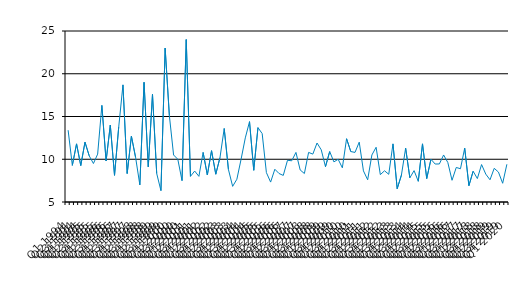
| Category | Series 0 |
|---|---|
| Q1 1994 | 13.4 |
| Q2 1994 | 9.28 |
| Q3 1994 | 11.8 |
| Q4 1994 | 9.26 |
| Q1 1995 | 12 |
| Q2 1995 | 10.4 |
| Q3 1995 | 9.5 |
| Q4 1995 | 10.6 |
| Q1 1996 | 16.3 |
| Q2 1996 | 9.8 |
| Q3 1996 | 14 |
| Q4 1996 | 8.12 |
| Q1 1997 | 13.8 |
| Q2 1997 | 18.7 |
| Q3 1997 | 8.33 |
| Q4 1997 | 12.7 |
| Q1 1998 | 10.2 |
| Q2 1998 | 7 |
| Q3 1998 | 19 |
| Q4 1998 | 9.11 |
| Q1 1999 | 17.6 |
| Q2 1999 | 8.33 |
| Q3 1999 | 6.33 |
| Q4 1999 | 23 |
| Q1 2000 | 15.1 |
| Q2 2000 | 10.5 |
| Q3 2000 | 10 |
| Q4 2000 | 7.5 |
| Q1 2001 | 24 |
| Q2 2001 | 8 |
| Q3 2001 | 8.62 |
| Q4 2001 | 8 |
| Q1 2002 | 10.8 |
| Q2 2002 | 8.16 |
| Q3 2002 | 11 |
| Q4 2002 | 8.25 |
| Q1 2003 | 10.2 |
| Q2 2003 | 13.6 |
| Q3 2003 | 8.8 |
| Q4 2003 | 6.83 |
| Q1 2004 | 7.66 |
| Q2 2004 | 10 |
| Q3 2004 | 12.5 |
| Q4 2004 | 14.4 |
| Q1 2005 | 8.71 |
| Q2 2005 | 13.7 |
| Q3 2005 | 13 |
| Q4 2005 | 8.44 |
| Q1 2006 | 7.33 |
| Q2 2006 | 8.83 |
| Q3 2006 | 8.33 |
| Q4 2006 | 8.11 |
| Q1 2007 | 9.88 |
| Q2 2007 | 9.82 |
| Q3 2007 | 10.8 |
| Q4 2007 | 8.75 |
| Q1 2008 | 8.33 |
| Q2 2008 | 10.8 |
| Q3 2008 | 10.6 |
| Q4 2008 | 11.9 |
| Q1 2009 | 11.1 |
| Q2 2009 | 9.13 |
| Q3 2009 | 10.9 |
| Q4 2009 | 9.69 |
| Q1 2010 | 10 |
| Q2 2010 | 9 |
| Q3 2010 | 12.4 |
| Q4 2010 | 10.9 |
| Q1 2011 | 10.8 |
| Q2 2011 | 12 |
| Q3 2011 | 8.64 |
| Q4 2011 | 7.6 |
| Q1 2012 | 10.5 |
| Q2 2012 | 11.4 |
| Q3 2012 | 8.2 |
| Q4 2012 | 8.65 |
| Q1 2013 | 8.24 |
| Q2 2013 | 11.8 |
| Q3 2013 | 6.55 |
| Q4 2013 | 8.14 |
| Q1 2014 | 11.3 |
| Q2 2014 | 7.83 |
| Q3 2014 | 8.67 |
| Q4 2014 | 7.42 |
| Q1 2015 | 11.8 |
| Q2 2015 | 7.74 |
| Q3 2015 | 10 |
| Q4 2015 | 9.44 |
| Q1 2016 | 9.45 |
| Q2 2016 | 10.5 |
| Q3 2016 | 9.62 |
| Q4 2016 | 7.54 |
| Q1 2017 | 9.04 |
| Q2 2017 | 8.89 |
| Q3 2017 | 11.3 |
| Q4 2017 | 6.91 |
| Q1 2018 | 8.6 |
| Q2 2018 | 7.74 |
| Q3 2018 | 9.38 |
| Q4 2018 | 8.26 |
| Q1 2019 | 7.6 |
| Q2 2019 | 8.941 |
| Q3 2019 | 8.5 |
| Q4 2019 | 7.19 |
| Q1 2020 | 9.41 |